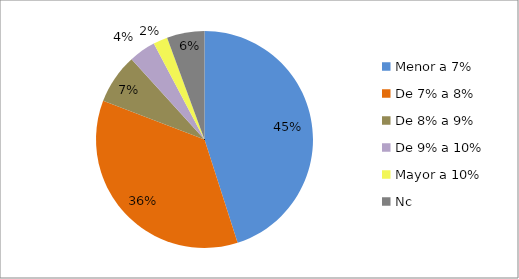
| Category | Series 0 | Series 1 | Series 2 |
|---|---|---|---|
| Menor a 7% |  |  | 169 |
| De 7% a 8% |  |  | 134 |
| De 8% a 9% |  |  | 28 |
| De 9% a 10% |  |  | 15 |
| Mayor a 10% |  |  | 8 |
| Nc |  |  | 21 |